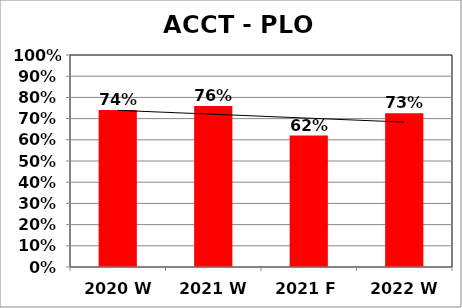
| Category | Series 0 |
|---|---|
| 2020 W | 0.74 |
| 2021 W | 0.76 |
| 2021 F | 0.62 |
| 2022 W | 0.725 |